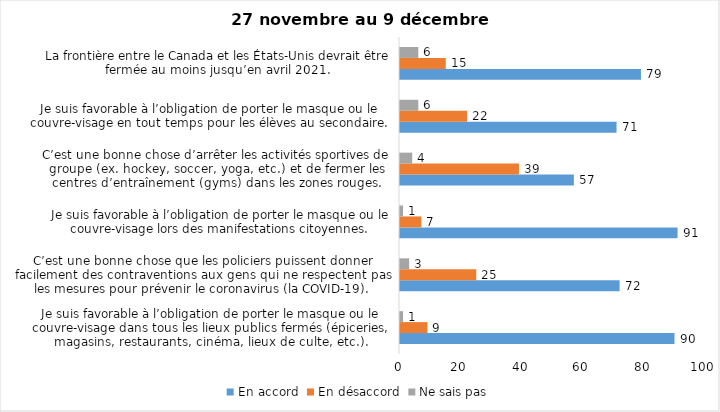
| Category | En accord | En désaccord | Ne sais pas |
|---|---|---|---|
| Je suis favorable à l’obligation de porter le masque ou le couvre-visage dans tous les lieux publics fermés (épiceries, magasins, restaurants, cinéma, lieux de culte, etc.). | 90 | 9 | 1 |
| C’est une bonne chose que les policiers puissent donner facilement des contraventions aux gens qui ne respectent pas les mesures pour prévenir le coronavirus (la COVID-19). | 72 | 25 | 3 |
| Je suis favorable à l’obligation de porter le masque ou le couvre-visage lors des manifestations citoyennes. | 91 | 7 | 1 |
| C’est une bonne chose d’arrêter les activités sportives de groupe (ex. hockey, soccer, yoga, etc.) et de fermer les centres d’entraînement (gyms) dans les zones rouges. | 57 | 39 | 4 |
| Je suis favorable à l’obligation de porter le masque ou le couvre-visage en tout temps pour les élèves au secondaire. | 71 | 22 | 6 |
| La frontière entre le Canada et les États-Unis devrait être fermée au moins jusqu’en avril 2021. | 79 | 15 | 6 |